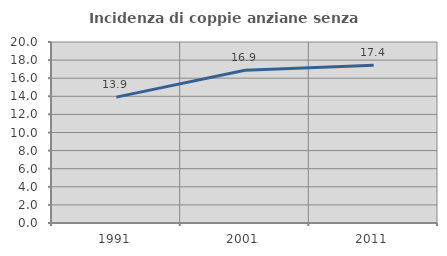
| Category | Incidenza di coppie anziane senza figli  |
|---|---|
| 1991.0 | 13.909 |
| 2001.0 | 16.872 |
| 2011.0 | 17.442 |